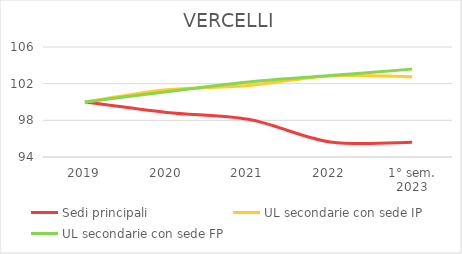
| Category | Sedi principali | UL secondarie con sede IP | UL secondarie con sede FP |
|---|---|---|---|
| 2019 | 100 | 100 | 100 |
| 2020 | 98.864 | 101.328 | 101.125 |
| 2021 | 98.11 | 101.803 | 102.18 |
| 2022 | 95.64 | 102.846 | 102.883 |
| 1° sem.
2023 | 95.603 | 102.751 | 103.586 |